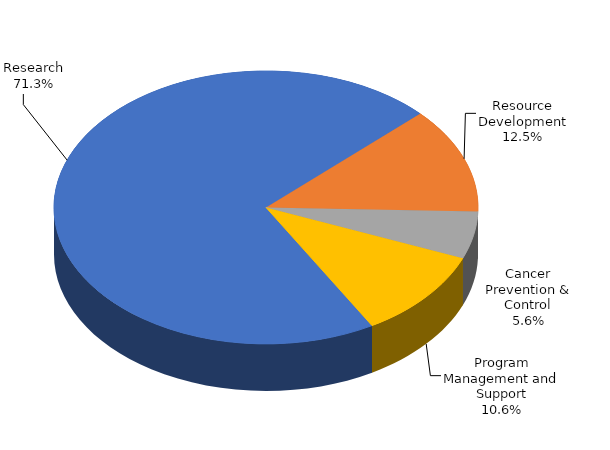
| Category | Research |
|---|---|
| Research | 0.713 |
| Resource Development | 0.125 |
| Cancer Prevention & Control | 0.056 |
| Program Management and Support | 0.106 |